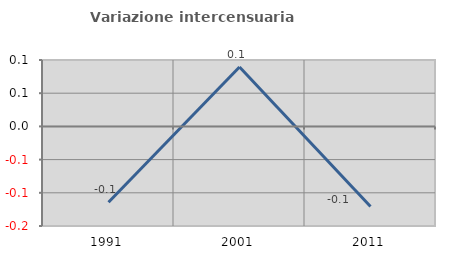
| Category | Variazione intercensuaria annua |
|---|---|
| 1991.0 | -0.114 |
| 2001.0 | 0.089 |
| 2011.0 | -0.121 |